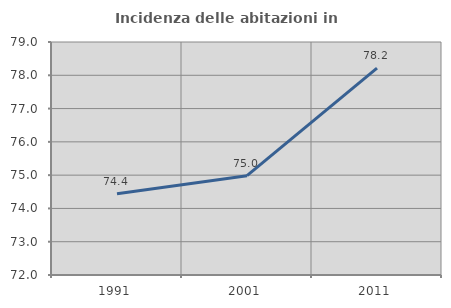
| Category | Incidenza delle abitazioni in proprietà  |
|---|---|
| 1991.0 | 74.44 |
| 2001.0 | 74.984 |
| 2011.0 | 78.213 |